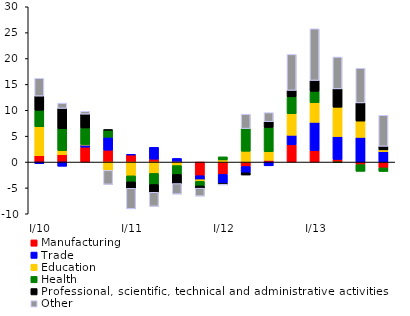
| Category | Manufacturing | Trade | Education | Health | Professional, scientific, technical and administrative activities | Other |
|---|---|---|---|---|---|---|
|  I/10 | 1.213 | -0.32 | 5.601 | 3.186 | 2.734 | 3.449 |
|  II | 1.415 | -0.817 | 0.799 | 4.217 | 3.92 | 1.037 |
|  III | 2.875 | 0.413 | 0.094 | 3.19 | 2.673 | 0.562 |
|  IV | 2.291 | 2.511 | -1.616 | 1.377 | 0.042 | -2.7 |
|  I/11 | 1.399 | 0.005 | -2.671 | -1.157 | -1.257 | -3.962 |
|  II | 0.554 | 2.292 | -2.195 | -2.149 | -1.505 | -2.719 |
|  III | 0 | 0.7 | -0.684 | -1.712 | -1.767 | -2.028 |
|  IV | -2.64 | -0.772 | -0.325 | -0.877 | -0.439 | -1.521 |
|  I/12 | -2.385 | -1.72 | 0.408 | 0.6 | -0.18 | -0.136 |
|  II | -0.865 | -1.22 | 2.082 | 4.376 | -0.422 | 2.788 |
|  III | 0.323 | -0.734 | 1.679 | 4.68 | 1.113 | 1.748 |
|  IV | 3.322 | 1.847 | 4.174 | 3.251 | 1.244 | 6.95 |
|  I/13 | 2.206 | 5.464 | 3.804 | 2.188 | 2.091 | 10 |
|  II | 0.494 | 4.434 | 5.657 | -0.101 | 3.551 | 6.166 |
|  III | -0.504 | 4.766 | 3.149 | -1.293 | 3.513 | 6.706 |
|  IV | -1.13 | 2.021 | 0.331 | -0.692 | 0.678 | 6.003 |